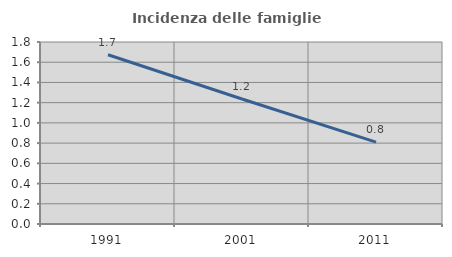
| Category | Incidenza delle famiglie numerose |
|---|---|
| 1991.0 | 1.674 |
| 2001.0 | 1.236 |
| 2011.0 | 0.81 |